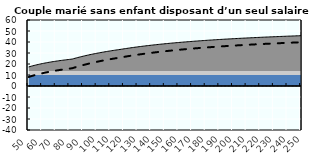
| Category | Coin fiscal moyen (somme des composantes) | Taux moyen d'imposition net en % du salaire brut |
|---|---|---|
| 50.0 | 17.339 | 8.205 |
| 51.0 | 17.698 | 8.603 |
| 52.0 | 18.042 | 8.986 |
| 53.0 | 18.374 | 9.354 |
| 54.0 | 18.693 | 9.709 |
| 55.0 | 19.001 | 10.05 |
| 56.0 | 19.297 | 10.38 |
| 57.0 | 19.584 | 10.698 |
| 58.0 | 19.86 | 11.005 |
| 59.0 | 20.127 | 11.301 |
| 60.0 | 20.385 | 11.588 |
| 61.0 | 20.635 | 11.865 |
| 62.0 | 20.876 | 12.133 |
| 63.0 | 21.11 | 12.393 |
| 64.0 | 21.337 | 12.645 |
| 65.0 | 21.557 | 12.889 |
| 66.0 | 21.77 | 13.125 |
| 67.0 | 21.976 | 13.355 |
| 68.0 | 22.177 | 13.577 |
| 69.0 | 22.372 | 13.794 |
| 70.0 | 22.561 | 14.004 |
| 71.0 | 22.745 | 14.208 |
| 72.0 | 22.923 | 14.406 |
| 73.0 | 23.097 | 14.6 |
| 74.0 | 23.266 | 14.787 |
| 75.0 | 23.431 | 14.97 |
| 76.0 | 23.591 | 15.148 |
| 77.0 | 23.748 | 15.322 |
| 78.0 | 23.9 | 15.491 |
| 79.0 | 24.048 | 15.655 |
| 80.0 | 24.193 | 15.816 |
| 81.0 | 24.334 | 15.972 |
| 82.0 | 24.514 | 16.173 |
| 83.0 | 24.865 | 16.562 |
| 84.0 | 25.207 | 16.943 |
| 85.0 | 25.542 | 17.314 |
| 86.0 | 25.868 | 17.677 |
| 87.0 | 26.187 | 18.031 |
| 88.0 | 26.499 | 18.377 |
| 89.0 | 26.804 | 18.716 |
| 90.0 | 27.102 | 19.047 |
| 91.0 | 27.393 | 19.37 |
| 92.0 | 27.678 | 19.687 |
| 93.0 | 27.957 | 19.997 |
| 94.0 | 28.23 | 20.3 |
| 95.0 | 28.498 | 20.597 |
| 96.0 | 28.759 | 20.887 |
| 97.0 | 29.016 | 21.172 |
| 98.0 | 29.267 | 21.451 |
| 99.0 | 29.513 | 21.724 |
| 100.0 | 29.754 | 21.992 |
| 101.0 | 29.99 | 22.254 |
| 102.0 | 30.222 | 22.512 |
| 103.0 | 30.449 | 22.764 |
| 104.0 | 30.672 | 23.011 |
| 105.0 | 30.891 | 23.254 |
| 106.0 | 31.105 | 23.492 |
| 107.0 | 31.316 | 23.726 |
| 108.0 | 31.522 | 23.955 |
| 109.0 | 31.725 | 24.181 |
| 110.0 | 31.924 | 24.402 |
| 111.0 | 32.12 | 24.619 |
| 112.0 | 32.312 | 24.832 |
| 113.0 | 32.5 | 25.041 |
| 114.0 | 32.685 | 25.247 |
| 115.0 | 32.868 | 25.449 |
| 116.0 | 33.047 | 25.648 |
| 117.0 | 33.224 | 25.845 |
| 118.0 | 33.424 | 26.067 |
| 119.0 | 33.62 | 26.285 |
| 120.0 | 33.813 | 26.499 |
| 121.0 | 34.003 | 26.71 |
| 122.0 | 34.189 | 26.917 |
| 123.0 | 34.373 | 27.121 |
| 124.0 | 34.554 | 27.322 |
| 125.0 | 34.731 | 27.519 |
| 126.0 | 34.906 | 27.714 |
| 127.0 | 35.079 | 27.905 |
| 128.0 | 35.248 | 28.093 |
| 129.0 | 35.415 | 28.278 |
| 130.0 | 35.579 | 28.461 |
| 131.0 | 35.741 | 28.641 |
| 132.0 | 35.9 | 28.817 |
| 133.0 | 36.057 | 28.992 |
| 134.0 | 36.212 | 29.163 |
| 135.0 | 36.364 | 29.333 |
| 136.0 | 36.514 | 29.499 |
| 137.0 | 36.662 | 29.664 |
| 138.0 | 36.808 | 29.825 |
| 139.0 | 36.952 | 29.985 |
| 140.0 | 37.093 | 30.142 |
| 141.0 | 37.233 | 30.297 |
| 142.0 | 37.371 | 30.45 |
| 143.0 | 37.506 | 30.601 |
| 144.0 | 37.64 | 30.749 |
| 145.0 | 37.772 | 30.896 |
| 146.0 | 37.902 | 31.04 |
| 147.0 | 38.031 | 31.183 |
| 148.0 | 38.157 | 31.324 |
| 149.0 | 38.282 | 31.462 |
| 150.0 | 38.406 | 31.599 |
| 151.0 | 38.527 | 31.734 |
| 152.0 | 38.647 | 31.868 |
| 153.0 | 38.766 | 31.999 |
| 154.0 | 38.883 | 32.129 |
| 155.0 | 38.998 | 32.257 |
| 156.0 | 39.112 | 32.384 |
| 157.0 | 39.225 | 32.509 |
| 158.0 | 39.336 | 32.632 |
| 159.0 | 39.445 | 32.754 |
| 160.0 | 39.554 | 32.874 |
| 161.0 | 39.661 | 32.993 |
| 162.0 | 39.766 | 33.111 |
| 163.0 | 39.871 | 33.226 |
| 164.0 | 39.974 | 33.341 |
| 165.0 | 40.076 | 33.454 |
| 166.0 | 40.176 | 33.566 |
| 167.0 | 40.276 | 33.676 |
| 168.0 | 40.374 | 33.785 |
| 169.0 | 40.471 | 33.893 |
| 170.0 | 40.567 | 33.999 |
| 171.0 | 40.662 | 34.105 |
| 172.0 | 40.755 | 34.209 |
| 173.0 | 40.848 | 34.312 |
| 174.0 | 40.939 | 34.413 |
| 175.0 | 41.03 | 34.514 |
| 176.0 | 41.119 | 34.613 |
| 177.0 | 41.208 | 34.711 |
| 178.0 | 41.295 | 34.808 |
| 179.0 | 41.382 | 34.905 |
| 180.0 | 41.467 | 34.999 |
| 181.0 | 41.552 | 35.093 |
| 182.0 | 41.636 | 35.186 |
| 183.0 | 41.718 | 35.278 |
| 184.0 | 41.8 | 35.369 |
| 185.0 | 41.881 | 35.459 |
| 186.0 | 41.961 | 35.548 |
| 187.0 | 42.04 | 35.636 |
| 188.0 | 42.119 | 35.723 |
| 189.0 | 42.196 | 35.809 |
| 190.0 | 42.273 | 35.894 |
| 191.0 | 42.349 | 35.979 |
| 192.0 | 42.424 | 36.062 |
| 193.0 | 42.499 | 36.145 |
| 194.0 | 42.572 | 36.226 |
| 195.0 | 42.645 | 36.307 |
| 196.0 | 42.717 | 36.387 |
| 197.0 | 42.788 | 36.467 |
| 198.0 | 42.859 | 36.545 |
| 199.0 | 42.929 | 36.623 |
| 200.0 | 42.998 | 36.7 |
| 201.0 | 43.067 | 36.776 |
| 202.0 | 43.135 | 36.851 |
| 203.0 | 43.202 | 36.926 |
| 204.0 | 43.268 | 37 |
| 205.0 | 43.334 | 37.073 |
| 206.0 | 43.4 | 37.145 |
| 207.0 | 43.464 | 37.217 |
| 208.0 | 43.528 | 37.288 |
| 209.0 | 43.592 | 37.358 |
| 210.0 | 43.654 | 37.428 |
| 211.0 | 43.717 | 37.497 |
| 212.0 | 43.778 | 37.566 |
| 213.0 | 43.839 | 37.633 |
| 214.0 | 43.9 | 37.701 |
| 215.0 | 43.959 | 37.767 |
| 216.0 | 44.019 | 37.833 |
| 217.0 | 44.078 | 37.898 |
| 218.0 | 44.136 | 37.963 |
| 219.0 | 44.194 | 38.027 |
| 220.0 | 44.251 | 38.09 |
| 221.0 | 44.307 | 38.153 |
| 222.0 | 44.364 | 38.216 |
| 223.0 | 44.419 | 38.278 |
| 224.0 | 44.474 | 38.339 |
| 225.0 | 44.529 | 38.4 |
| 226.0 | 44.583 | 38.46 |
| 227.0 | 44.637 | 38.519 |
| 228.0 | 44.69 | 38.579 |
| 229.0 | 44.743 | 38.637 |
| 230.0 | 44.795 | 38.695 |
| 231.0 | 44.847 | 38.753 |
| 232.0 | 44.899 | 38.81 |
| 233.0 | 44.95 | 38.867 |
| 234.0 | 45 | 38.923 |
| 235.0 | 45.05 | 38.978 |
| 236.0 | 45.1 | 39.034 |
| 237.0 | 45.149 | 39.088 |
| 238.0 | 45.198 | 39.142 |
| 239.0 | 45.247 | 39.196 |
| 240.0 | 45.295 | 39.25 |
| 241.0 | 45.342 | 39.303 |
| 242.0 | 45.389 | 39.355 |
| 243.0 | 45.436 | 39.407 |
| 244.0 | 45.483 | 39.459 |
| 245.0 | 45.529 | 39.51 |
| 246.0 | 45.575 | 39.561 |
| 247.0 | 45.62 | 39.611 |
| 248.0 | 45.665 | 39.661 |
| 249.0 | 45.71 | 39.71 |
| 250.0 | 45.754 | 39.76 |